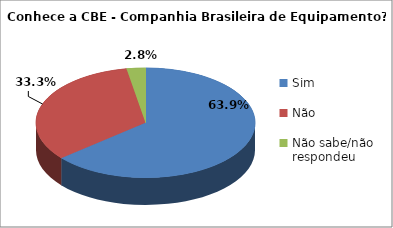
| Category | Series 0 |
|---|---|
| Sim | 23 |
| Não | 12 |
| Não sabe/não respondeu | 1 |